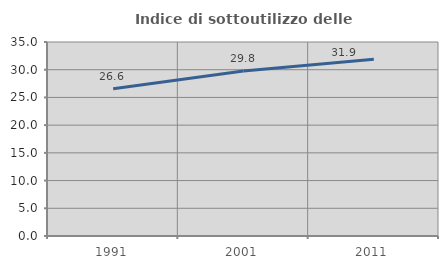
| Category | Indice di sottoutilizzo delle abitazioni  |
|---|---|
| 1991.0 | 26.566 |
| 2001.0 | 29.764 |
| 2011.0 | 31.892 |